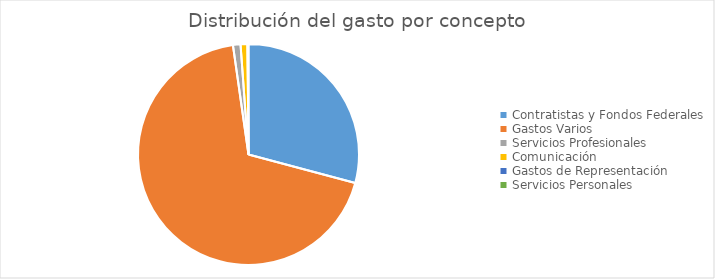
| Category | Series 0 |
|---|---|
| Contratistas y Fondos Federales | 160368278.98 |
| Gastos Varios | 377189551.61 |
| Servicios Profesionales | 6054639.88 |
| Comunicación | 5545212.45 |
| Gastos de Representación | 79403.54 |
| Servicios Personales | 710830.2 |